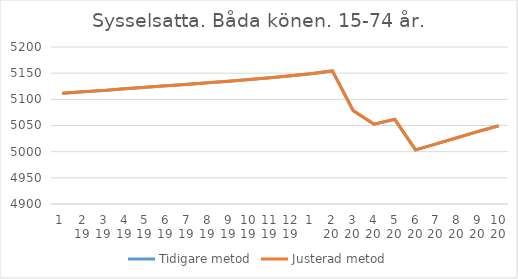
| Category | Tidigare metod | Justerad metod |
|---|---|---|
| 0 | 5111.7 | 5111.73 |
| 1 | 5114.29 | 5114.33 |
| 2 | 5117.07 | 5117.12 |
| 3 | 5120.03 | 5120.06 |
| 4 | 5122.96 | 5122.98 |
| 5 | 5125.76 | 5125.75 |
| 6 | 5128.6 | 5128.56 |
| 7 | 5131.56 | 5131.51 |
| 8 | 5134.67 | 5134.61 |
| 9 | 5137.93 | 5137.88 |
| 10 | 5141.3 | 5141.28 |
| 11 | 5144.92 | 5144.94 |
| 12 | 5149.1 | 5149.16 |
| 13 | 5154.26 | 5154.36 |
| 14 | 5078.3 | 5078.43 |
| 15 | 5052.49 | 5052.62 |
| 16 | 5061.78 | 5061.88 |
| 17 | 5003.41 | 5003.43 |
| 18 | 5014.93 | 5014.84 |
| 19 | 5026.88 | 5026.63 |
| 20 | 5038.65 | 5038.21 |
| 21 | 5049.68 | 5049.03 |